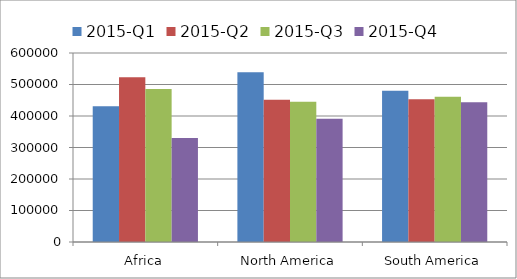
| Category | 2015-Q1 | 2015-Q2 | 2015-Q3 | 2015-Q4 |
|---|---|---|---|---|
| Africa | 431339 | 523264 | 485838 | 330235 |
| North America | 538794 | 451338 | 445601 | 391023 |
| South America | 480226 | 453437 | 461390 | 443384 |